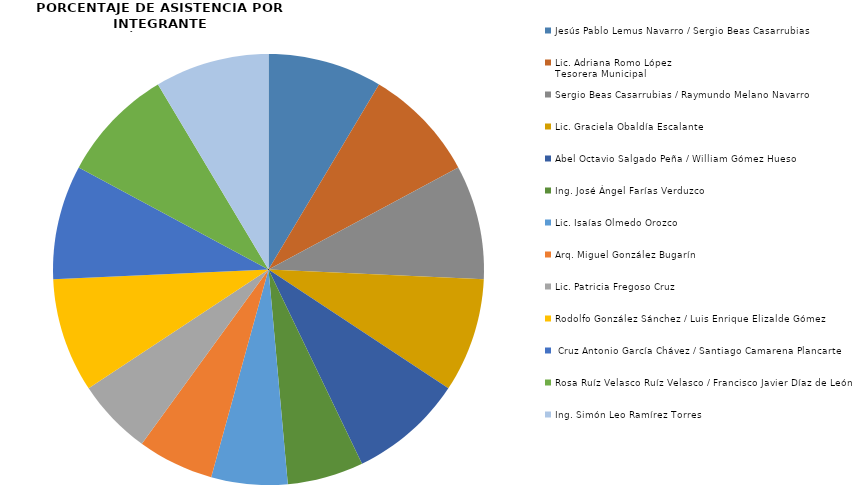
| Category | Series 0 |
|---|---|
| Jesús Pablo Lemus Navarro / Sergio Beas Casarrubias | 3 |
| Lic. Adriana Romo López
Tesorera Municipal | 3 |
| Sergio Beas Casarrubias / Raymundo Melano Navarro | 3 |
| Lic. Graciela Obaldía Escalante | 3 |
| Abel Octavio Salgado Peña / William Gómez Hueso | 3 |
| Ing. José Ángel Farías Verduzco | 2 |
| Lic. Isaías Olmedo Orozco | 2 |
| Arq. Miguel González Bugarín | 2 |
| Lic. Patricia Fregoso Cruz | 2 |
| Rodolfo González Sánchez / Luis Enrique Elizalde Gómez | 3 |
|  Cruz Antonio García Chávez / Santiago Camarena Plancarte | 3 |
| Rosa Ruíz Velasco Ruíz Velasco / Francisco Javier Díaz de León | 3 |
| Ing. Simón Leo Ramírez Torres | 3 |